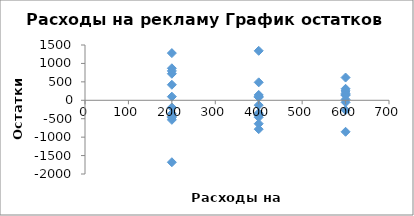
| Category | Series 0 |
|---|---|
| 200.0 | 720.69 |
| 200.0 | 421.69 |
| 200.0 | -364.31 |
| 200.0 | 98.69 |
| 400.0 | 83.079 |
| 400.0 | 487.079 |
| 400.0 | -635.921 |
| 400.0 | -388.921 |
| 600.0 | 134.467 |
| 600.0 | 254.467 |
| 600.0 | -854.533 |
| 600.0 | 149.467 |
| 200.0 | -439.963 |
| 200.0 | -1680.963 |
| 200.0 | 1280.037 |
| 200.0 | 868.037 |
| 400.0 | -783.574 |
| 400.0 | -348.574 |
| 400.0 | -460.574 |
| 400.0 | 1342.426 |
| 600.0 | 311.814 |
| 600.0 | -55.186 |
| 600.0 | -269.186 |
| 600.0 | 23.814 |
| 200.0 | -195.616 |
| 200.0 | -530.616 |
| 200.0 | 796.384 |
| 200.0 | -471.616 |
| 400.0 | 99.772 |
| 400.0 | -132.228 |
| 400.0 | 144.772 |
| 400.0 | -412.228 |
| 600.0 | 617.161 |
| 600.0 | 190.161 |